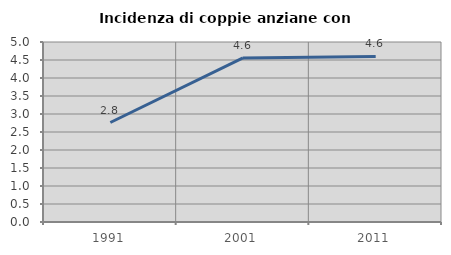
| Category | Incidenza di coppie anziane con figli |
|---|---|
| 1991.0 | 2.764 |
| 2001.0 | 4.556 |
| 2011.0 | 4.598 |